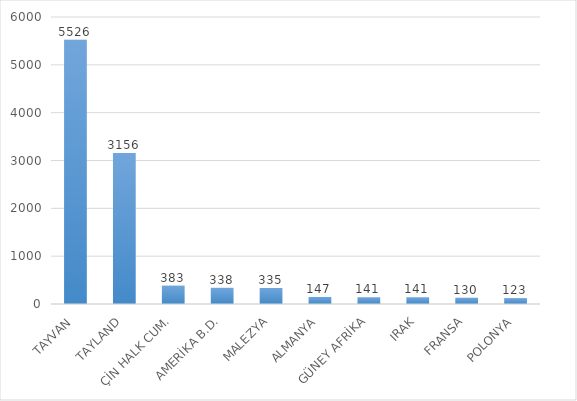
| Category | Series 0 |
|---|---|
| TAYVAN | 5526 |
| TAYLAND | 3156 |
| ÇİN HALK CUM. | 383 |
| AMERİKA B.D. | 338 |
| MALEZYA | 335 |
| ALMANYA | 147 |
| GÜNEY AFRİKA | 141 |
| IRAK | 141 |
| FRANSA | 130 |
| POLONYA | 123 |